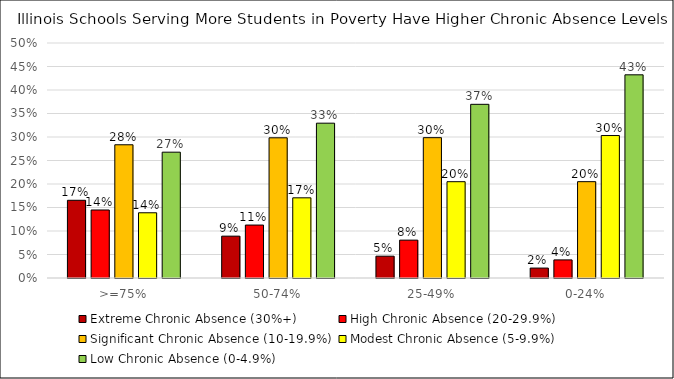
| Category | Extreme Chronic Absence (30%+) | High Chronic Absence (20-29.9%) | Significant Chronic Absence (10-19.9%) | Modest Chronic Absence (5-9.9%) | Low Chronic Absence (0-4.9%) |
|---|---|---|---|---|---|
| >=75% | 0.165 | 0.145 | 0.283 | 0.139 | 0.268 |
| 50-74% | 0.089 | 0.113 | 0.298 | 0.171 | 0.329 |
| 25-49% | 0.046 | 0.081 | 0.299 | 0.205 | 0.37 |
| 0-24% | 0.021 | 0.039 | 0.205 | 0.303 | 0.432 |